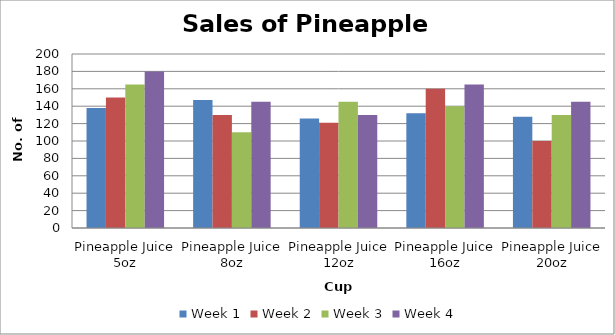
| Category | Week 1 | Week 2 | Week 3 | Week 4 |
|---|---|---|---|---|
| Pineapple Juice 5oz | 138 | 150 | 165 | 180 |
| Pineapple Juice 8oz | 147 | 130 | 110 | 145 |
| Pineapple Juice 12oz | 126 | 121 | 145 | 130 |
| Pineapple Juice 16oz | 132 | 160 | 140 | 165 |
| Pineapple Juice 20oz | 128 | 100 | 130 | 145 |